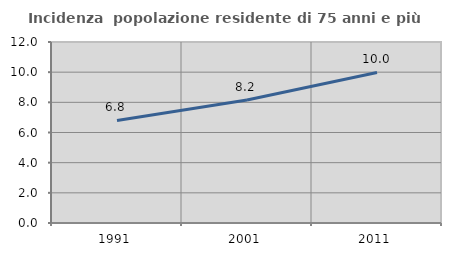
| Category | Incidenza  popolazione residente di 75 anni e più |
|---|---|
| 1991.0 | 6.801 |
| 2001.0 | 8.152 |
| 2011.0 | 9.98 |